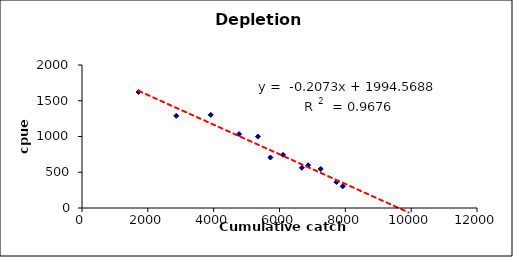
| Category | CPUE |
|---|---|
| 1717.4862230909002 | 1623.657 |
| 2862.477038484834 | 1289 |
| 3912.0519525959394 | 1302.385 |
| 4770.79506414139 | 1034.355 |
| 5343.290471838357 | 999.232 |
| 5724.954076969668 | 706.358 |
| 6106.617682100979 | 743.269 |
| 6679.113089797946 | 562.083 |
| 6869.944892363601 | 597.975 |
| 7251.608497494913 | 545.923 |
| 7728.688003909052 | 362.31 |
| 7919.519806474707 | 303.017 |